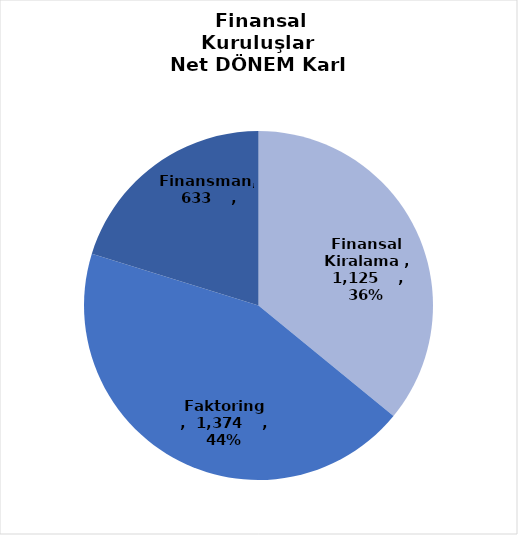
| Category | Series 0 |
|---|---|
| Finansal Kiralama  | 1125 |
| Faktoring  | 1374 |
| Finansman | 633 |